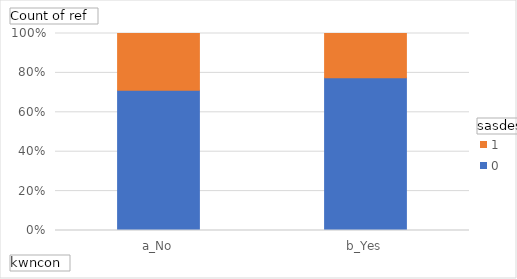
| Category | 0 | 1 |
|---|---|---|
| a_No | 1259 | 511 |
| b_Yes | 411 | 119 |